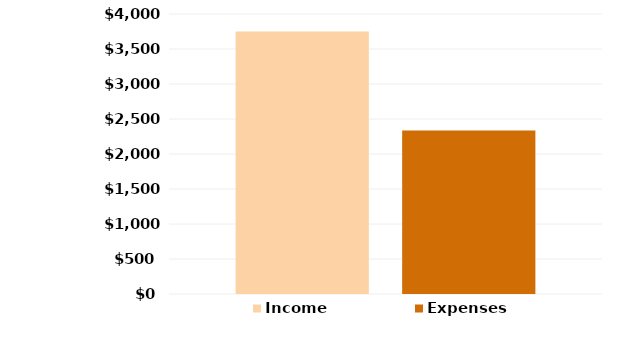
| Category | Income | Expenses |
|---|---|---|
| 0 | 3750 | 2336 |